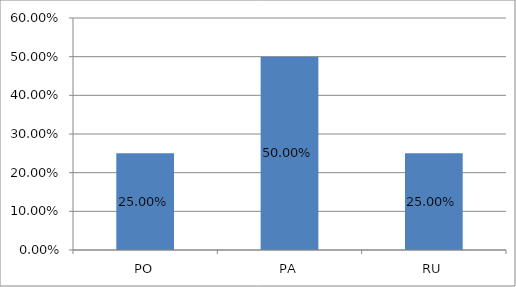
| Category | Series 0 |
|---|---|
| PO | 0.25 |
| PA | 0.5 |
| RU | 0.25 |